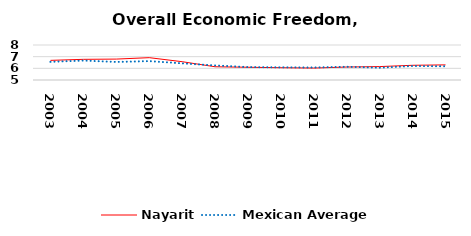
| Category | Nayarit | Mexican Average  |
|---|---|---|
| 2003.0 | 6.682 | 6.552 |
| 2004.0 | 6.771 | 6.668 |
| 2005.0 | 6.792 | 6.546 |
| 2006.0 | 6.915 | 6.619 |
| 2007.0 | 6.569 | 6.428 |
| 2008.0 | 6.135 | 6.248 |
| 2009.0 | 6.091 | 6.106 |
| 2010.0 | 6.053 | 6.086 |
| 2011.0 | 6.023 | 6.074 |
| 2012.0 | 6.113 | 6.134 |
| 2013.0 | 6.15 | 6.054 |
| 2014.0 | 6.262 | 6.2 |
| 2015.0 | 6.296 | 6.174 |